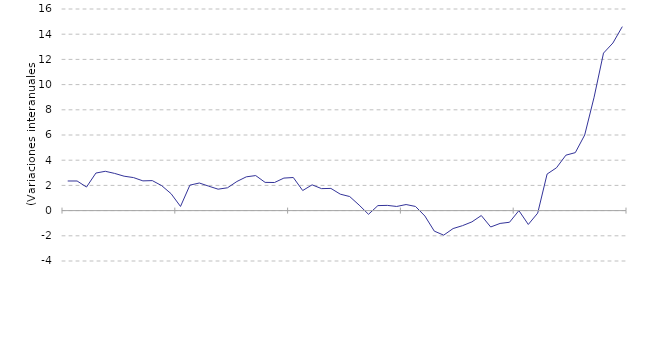
| Category | IPRI, General |
|---|---|
| nan | 2.35 |
| nan | 2.35 |
| nan | 1.87 |
| nan | 2.98 |
| nan | 3.12 |
| 2017.0 | 2.95 |
| nan | 2.73 |
| nan | 2.62 |
| nan | 2.36 |
| nan | 2.38 |
| nan | 1.98 |
| nan | 1.34 |
| nan | 0.33 |
| nan | 2.02 |
| nan | 2.19 |
| nan | 1.94 |
| nan | 1.7 |
| 2018.0 | 1.81 |
| nan | 2.31 |
| nan | 2.68 |
| nan | 2.78 |
| nan | 2.24 |
| nan | 2.23 |
| nan | 2.58 |
| nan | 2.626 |
| nan | 1.593 |
| nan | 2.045 |
| nan | 1.745 |
| nan | 1.761 |
| 2019.0 | 1.305 |
| nan | 1.116 |
| nan | 0.44 |
| nan | -0.294 |
| nan | 0.397 |
| nan | 0.414 |
| nan | 0.328 |
| nan | 0.482 |
| nan | 0.328 |
| nan | -0.43 |
| nan | -1.629 |
| nan | -1.948 |
| 2020.0 | -1.425 |
| nan | -1.195 |
| nan | -0.896 |
| nan | -0.392 |
| nan | -1.3 |
| nan | -1.018 |
| nan | -0.925 |
| nan | 0 |
| nan | -1.1 |
| nan | -0.2 |
| nan | 2.9 |
| nan | 3.4 |
| 2021.0 | 4.4 |
| nan | 4.6 |
| nan | 6 |
| nan | 9 |
| nan | 12.5 |
| nan | 13.3 |
| nan | 14.6 |